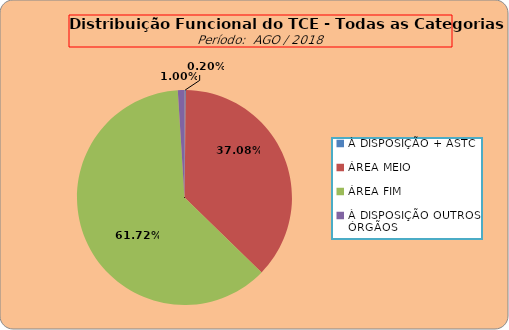
| Category | Series 0 |
|---|---|
| À DISPOSIÇÃO + ASTC | 1 |
| ÁREA MEIO | 185 |
| ÁREA FIM | 308 |
| À DISPOSIÇÃO OUTROS ÓRGÃOS | 5 |